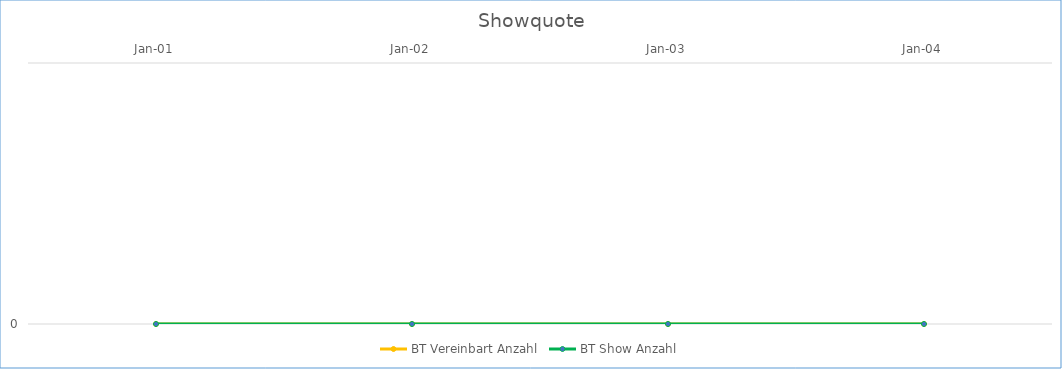
| Category | BT Vereinbart Anzahl | BT Show Anzahl |
|---|---|---|
| 2001-01-01 | 0 | 0 |
| 2002-01-01 | 0 | 0 |
| 2003-01-01 | 0 | 0 |
| 2004-01-01 | 0 | 0 |